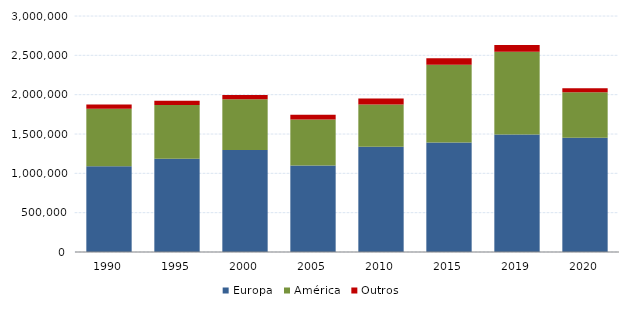
| Category | Europa | América | Outros |
|---|---|---|---|
| 1990.0 | 1089715 | 730429 | 53313 |
| 1995.0 | 1184057 | 685649 | 52614 |
| 2000.0 | 1297016 | 644901 | 53469 |
| 2005.0 | 1100491 | 583816 | 60434 |
| 2010.0 | 1336976 | 537339 | 76077 |
| 2015.0 | 1391068 | 990048 | 80354 |
| 2019.0 | 1493128 | 1051484 | 86947 |
| 2020.0 | 1451252 | 579178 | 50989 |